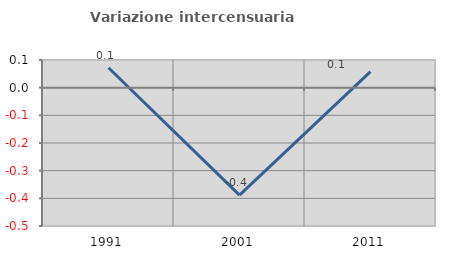
| Category | Variazione intercensuaria annua |
|---|---|
| 1991.0 | 0.072 |
| 2001.0 | -0.389 |
| 2011.0 | 0.058 |